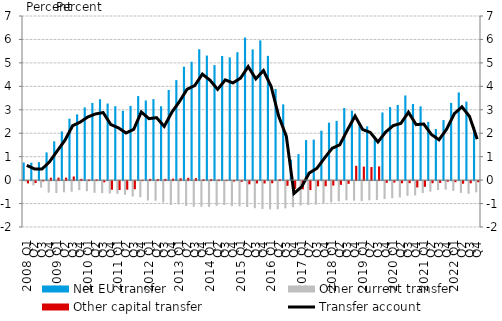
| Category | Net EU transfer | Other current transfer | Other capital transfer |
|---|---|---|---|
| 2008 Q1 | 0.75 | -0.024 | -0.097 |
| Q2 | 0.743 | -0.185 | -0.082 |
| Q3 | 0.766 | -0.279 | -0.013 |
| Q4 | 1.182 | -0.491 | 0.102 |
| 2009 Q1 | 1.655 | -0.507 | 0.104 |
| Q2 | 2.076 | -0.478 | 0.104 |
| Q3 | 2.619 | -0.453 | 0.154 |
| Q4 | 2.804 | -0.382 | 0.054 |
| 2010 Q1 | 3.102 | -0.432 | 0.026 |
| Q2 | 3.293 | -0.498 | 0.028 |
| Q3 | 3.448 | -0.516 | -0.051 |
| Q4 | 3.267 | -0.53 | -0.367 |
| 2011 Q1 | 3.152 | -0.544 | -0.379 |
| Q2 | 2.957 | -0.582 | -0.365 |
| Q3 | 3.167 | -0.656 | -0.346 |
| Q4 | 3.584 | -0.686 | 0.007 |
| 2012 Q1 | 3.396 | -0.826 | 0.051 |
| Q2 | 3.454 | -0.835 | 0.044 |
| Q3 | 3.15 | -0.912 | 0.053 |
| Q4 | 3.847 | -1.016 | 0.064 |
| 2013 Q1 | 4.266 | -0.992 | 0.078 |
| Q2 | 4.838 | -1.058 | 0.099 |
| Q3 | 5.048 | -1.095 | 0.081 |
| Q4 | 5.582 | -1.094 | 0.034 |
| 2014 Q1 | 5.313 | -1.097 | 0.044 |
| Q2 | 4.905 | -1.055 | 0.021 |
| Q3 | 5.297 | -1.022 | 0 |
| Q4 | 5.235 | -1.071 | -0.019 |
| 2015 Q1 | 5.456 | -1.076 | -0.029 |
| Q2 | 6.083 | -1.106 | -0.136 |
| Q3 | 5.575 | -1.156 | -0.099 |
| Q4 | 5.961 | -1.19 | -0.099 |
| 2016 Q1 | 5.299 | -1.206 | -0.092 |
| Q2 | 3.886 | -1.199 | 0.037 |
| Q3 | 3.229 | -1.162 | -0.201 |
| Q4 | 0.872 | -1.11 | -0.33 |
| 2017 Q1 | 1.108 | -1.043 | -0.35 |
| Q2 | 1.706 | -1.022 | -0.381 |
| Q3 | 1.727 | -1.002 | -0.223 |
| Q4 | 2.109 | -0.949 | -0.219 |
| 2018 Q1 | 2.451 | -0.903 | -0.19 |
| Q2 | 2.527 | -0.862 | -0.158 |
| Q3 | 3.074 | -0.821 | -0.114 |
| Q4 | 2.96 | -0.836 | 0.609 |
| 2019 Q1 | 2.431 | -0.851 | 0.577 |
| Q2 | 2.294 | -0.819 | 0.558 |
| Q3 | 1.85 | -0.809 | 0.586 |
| Q4 | 2.886 | -0.766 | -0.072 |
| 2020 Q1 | 3.116 | -0.728 | -0.062 |
| Q2 | 3.206 | -0.695 | -0.092 |
| Q3 | 3.611 | -0.628 | -0.088 |
| Q4 | 3.247 | -0.61 | -0.27 |
| 2021 Q1 | 3.145 | -0.509 | -0.243 |
| Q2 | 2.483 | -0.449 | -0.089 |
| Q3 | 2.179 | -0.382 | -0.077 |
| Q4 | 2.562 | -0.362 | -0.026 |
| 2022 Q1 | 3.295 | -0.418 | -0.045 |
| Q2 | 3.739 | -0.504 | -0.112 |
| Q3 | 3.348 | -0.54 | -0.093 |
| Q4 | 2.275 | -0.48 | -0.047 |